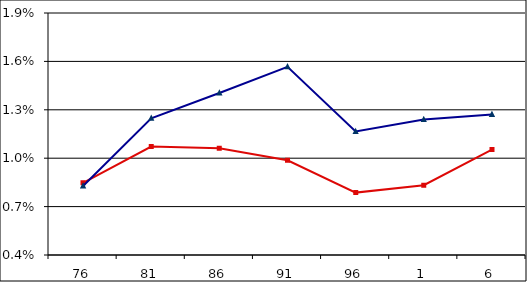
| Category | Series2 | Series3 |
|---|---|---|
| 0 | 0.008 | 0.008 |
| 1 | 0.011 | 0.012 |
| 2 | 0.011 | 0.014 |
| 3 | 0.01 | 0.016 |
| 4 | 0.008 | 0.012 |
| 5 | 0.008 | 0.012 |
| 6 | 0.011 | 0.013 |